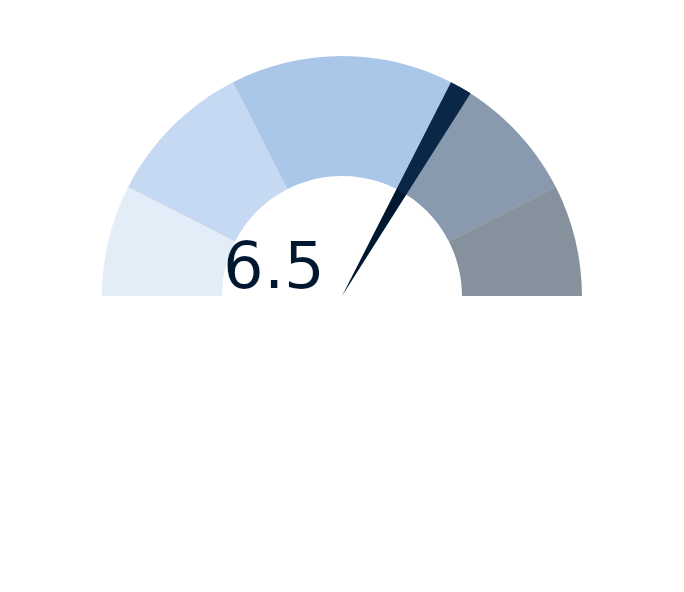
| Category | Series 2 |
|---|---|
| 0 | 6.5 |
| 1 | 0.3 |
| 2 | 13.2 |